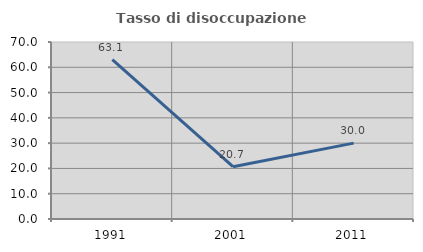
| Category | Tasso di disoccupazione giovanile  |
|---|---|
| 1991.0 | 63.077 |
| 2001.0 | 20.69 |
| 2011.0 | 30 |